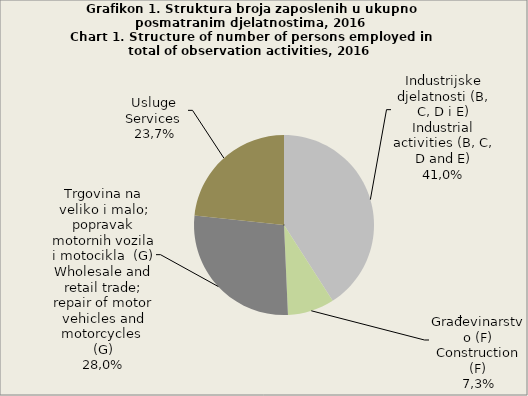
| Category | Broj zaposlenih osoba
Number of persons employed
  0 |
|---|---|
| Industrijske djelatnosti (B, C, D i E)
Industrial activities (B, C, D and E) | 40.9 |
| Građevinarstvo (F)
Construction (F) | 8.4 |
| Trgovina na veliko i malo; popravak motornih vozila i motocikla  (G) 
Wholesale and retail trade; repair of motor vehicles and motorcycles  (G)
 | 27.4 |
| Usluge (H, I i L)
Services (H, I and L) | 23.3 |